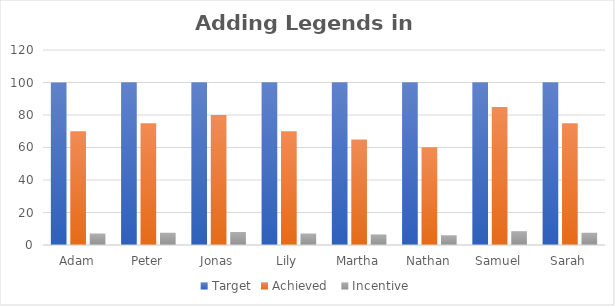
| Category | Target | Achieved  | Incentive |
|---|---|---|---|
| Adam | 100 | 70 | 7 |
| Peter | 100 | 75 | 7.5 |
| Jonas | 100 | 80 | 8 |
| Lily | 100 | 70 | 7 |
| Martha | 100 | 65 | 6.5 |
| Nathan | 100 | 60 | 6 |
| Samuel | 100 | 85 | 8.5 |
| Sarah | 100 | 75 | 7.5 |